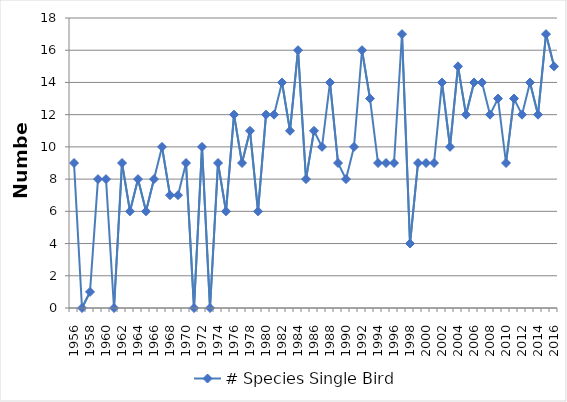
| Category | # Species Single Bird |
|---|---|
| 1956.0 | 9 |
| 1957.0 | 0 |
| 1958.0 | 1 |
| 1959.0 | 8 |
| 1960.0 | 8 |
| 1961.0 | 0 |
| 1962.0 | 9 |
| 1963.0 | 6 |
| 1964.0 | 8 |
| 1965.0 | 6 |
| 1966.0 | 8 |
| 1967.0 | 10 |
| 1968.0 | 7 |
| 1969.0 | 7 |
| 1970.0 | 9 |
| 1971.0 | 0 |
| 1972.0 | 10 |
| 1973.0 | 0 |
| 1974.0 | 9 |
| 1975.0 | 6 |
| 1976.0 | 12 |
| 1977.0 | 9 |
| 1978.0 | 11 |
| 1979.0 | 6 |
| 1980.0 | 12 |
| 1981.0 | 12 |
| 1982.0 | 14 |
| 1983.0 | 11 |
| 1984.0 | 16 |
| 1985.0 | 8 |
| 1986.0 | 11 |
| 1987.0 | 10 |
| 1988.0 | 14 |
| 1989.0 | 9 |
| 1990.0 | 8 |
| 1991.0 | 10 |
| 1992.0 | 16 |
| 1993.0 | 13 |
| 1994.0 | 9 |
| 1995.0 | 9 |
| 1996.0 | 9 |
| 1997.0 | 17 |
| 1998.0 | 4 |
| 1999.0 | 9 |
| 2000.0 | 9 |
| 2001.0 | 9 |
| 2002.0 | 14 |
| 2003.0 | 10 |
| 2004.0 | 15 |
| 2005.0 | 12 |
| 2006.0 | 14 |
| 2007.0 | 14 |
| 2008.0 | 12 |
| 2009.0 | 13 |
| 2010.0 | 9 |
| 2011.0 | 13 |
| 2012.0 | 12 |
| 2013.0 | 14 |
| 2014.0 | 12 |
| 2015.0 | 17 |
| 2016.0 | 15 |